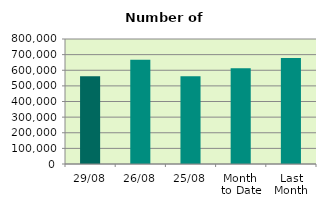
| Category | Series 0 |
|---|---|
| 29/08 | 561356 |
| 26/08 | 666960 |
| 25/08 | 562224 |
| Month 
to Date | 613110.095 |
| Last
Month | 677996.667 |